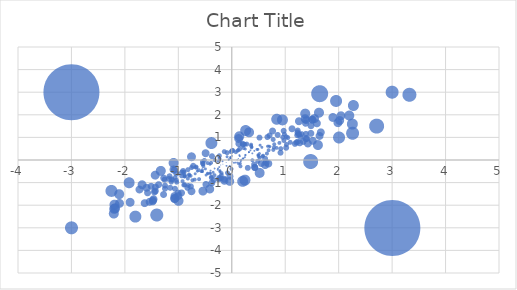
| Category | Series 0 |
|---|---|
| 0.160946651876732 | -0.274 |
| -0.615124180067025 | -0.841 |
| -0.238992660518427 | 0.202 |
| 0.614980688566654 | 0.075 |
| -0.901399740475513 | -1.096 |
| 0.348077717998722 | 0.426 |
| 0.947959158309703 | 1.018 |
| -1.72987447164957 | -1.3 |
| 0.0971250760577167 | 0.05 |
| 1.37857743076593 | 0.961 |
| -0.916733728524122 | -0.47 |
| -1.035666336437 | -0.968 |
| -0.224145165452657 | -0.513 |
| 2.70219252104673 | 1.52 |
| 0.520233681443548 | -0.569 |
| -0.459716828268949 | -0.57 |
| 0.765993572091399 | 0.927 |
| -0.802699944823501 | -0.633 |
| -0.262195468911025 | -0.371 |
| 1.58348036764361 | 1.645 |
| 1.65870819725486 | 1.239 |
| -0.390094702698103 | 0.77 |
| -1.07746904537421 | -1.686 |
| -0.242535334187792 | -0.772 |
| -1.57870613654062 | -1.445 |
| -0.894718571122171 | -0.531 |
| 0.516387038247074 | 0.995 |
| -1.62979103842948 | -1.91 |
| 0.296839254848134 | -0.343 |
| 0.278366491918356 | 0.71 |
| -1.13284176934728 | -0.975 |
| -0.324500552176947 | 0.012 |
| -1.33606163125554 | -0.464 |
| 0.380607522894947 | 0.303 |
| 2.0134998490355 | 1.759 |
| -1.43600033947788 | -1.179 |
| 1.04205325234069 | 1.003 |
| 0.244543674262494 | 0.227 |
| 1.38559620247189 | 1.161 |
| 0.248287439296835 | 0.247 |
| 0.133289291835339 | 1.064 |
| -2.25582289472346 | -1.358 |
| -0.398868811937196 | -0.466 |
| 0.199769403632539 | 0.698 |
| 1.22291797992834 | 1.235 |
| -0.342927631277945 | -0.869 |
| -0.143765697169237 | -0.849 |
| 0.412032153731006 | -0.189 |
| 1.2289241542928 | 0.813 |
| 1.42092287875088 | 0.737 |
| -0.0943369723016265 | 0.338 |
| 0.154736995946148 | -0.14 |
| -0.729374576435108 | -0.239 |
| -0.685610712656531 | -0.609 |
| -1.40929884094785 | -2.42 |
| -0.939915624690563 | -0.534 |
| -1.60339226401106 | -1.211 |
| 0.00958780984204322 | 0.435 |
| -0.410777708551837 | -0.18 |
| 0.12003371847159 | 0.444 |
| 0.31656943258921 | 0.356 |
| -0.739846252762422 | -0.888 |
| 1.3736298282967 | 2.054 |
| 1.26277412193541 | 0.779 |
| 0.659726460285925 | 1.033 |
| -0.193893966526571 | -0.571 |
| -0.554283939642186 | -0.421 |
| -1.25595506815388 | -1.118 |
| -0.884081299107951 | -0.73 |
| -1.16478087259423 | -0.719 |
| -1.0696558947721 | -1.255 |
| 0.575700237428579 | 0.159 |
| 2.24777841377026 | 1.61 |
| 0.238687291933 | -0.873 |
| 0.761270682578169 | 1.286 |
| -0.35464424898648 | -0.531 |
| -2.2077409492235 | -2.368 |
| -0.037189918367408 | -0.262 |
| 0.0328181724199283 | -0.103 |
| -1.18071868225266 | -0.828 |
| 0.176503539493442 | 0.029 |
| 1.47801327160652 | 1.527 |
| -0.226956332484346 | -0.458 |
| -0.881372321196067 | -0.713 |
| 0.521825087151675 | 0.102 |
| 0.480749457099265 | 0.487 |
| -0.576551001997264 | -0.497 |
| 0.165373655010413 | -0.049 |
| 0.0961730276308223 | 0.003 |
| -1.0795466274732 | -1.578 |
| -1.04372701538641 | -0.884 |
| -0.552592535449565 | -0.496 |
| -0.144643103648489 | -0.902 |
| 0.255553105737754 | 1.313 |
| -0.645754552755135 | -0.493 |
| 0.366965786381292 | 0.542 |
| -1.45540269402899 | -1.396 |
| 0.36171378940403 | 0.68 |
| 0.584738888834613 | 0.193 |
| 1.2303702555631 | 1.313 |
| 0.13612221278788 | 0.23 |
| -0.75641933311179 | 0.148 |
| 0.201461556067091 | 0.728 |
| 1.2350449519675 | 1.165 |
| 0.122176622145269 | 0.079 |
| 2.26921479009631 | 2.426 |
| 1.36709151016331 | 1.839 |
| -1.09699595095752 | -0.408 |
| -2.10922785658634 | -1.505 |
| -0.492223106867984 | -1.058 |
| 1.6258528814413 | 2.107 |
| 1.21625775715046 | 1.117 |
| -0.236066546333457 | 0.075 |
| -0.167677831941503 | -0.179 |
| 0.140998784969456 | 0.191 |
| -1.43650247367118 | -0.664 |
| -0.0590232346457145 | 0.038 |
| 0.64011578054153 | -0.109 |
| 0.00128070794671652 | 0.18 |
| 0.619913414094182 | -0.218 |
| 0.110262010027443 | -0.113 |
| -1.92261768418304 | -1.002 |
| -0.024052773794113 | 0.144 |
| -0.386362633615433 | -0.732 |
| -0.69812768671063 | -0.859 |
| 0.00202187886730832 | 0.434 |
| -0.205936368594316 | -0.806 |
| -1.0762481700825 | -0.443 |
| -0.77108477696187 | -1.153 |
| 1.33181821435059 | 0.834 |
| -1.3773593544243 | -1.071 |
| -1.00842096559924 | -1.454 |
| -0.921229870327564 | -0.936 |
| 0.236247621529173 | 0.142 |
| 1.88459375859967 | 1.9 |
| 2.19072418627481 | 1.986 |
| 1.3024521514489 | 1.157 |
| -2.20157151487506 | -1.961 |
| 1.01436566004417 | 1.037 |
| 0.0678569007901561 | 0.364 |
| -1.00365372459943 | -1.792 |
| 1.63546048211918 | 2.956 |
| -0.550327791081784 | -0.148 |
| -0.390768462835063 | -0.767 |
| -0.395259857391023 | -0.104 |
| -0.492406833780947 | 0.308 |
| -0.263170050333482 | -0.044 |
| 0.378366619189462 | 0.574 |
| 0.54558768172162 | -0.136 |
| -0.0424101694434541 | -0.702 |
| -1.0750092090895 | -1.68 |
| 0.124514748254044 | -0.159 |
| -0.375935062910946 | 0.18 |
| -0.565899622209159 | -0.496 |
| -0.825763906440871 | -0.807 |
| -1.16081348131615 | -1.209 |
| -0.109728575653995 | -0.101 |
| -0.0455316197579109 | -0.929 |
| 0.910025577600881 | 0.327 |
| 1.38893253292281 | 1.769 |
| 1.0101751389894 | 0.56 |
| -0.545302776391033 | -1.365 |
| -0.450405230399172 | -0.601 |
| 0.242665773001131 | 0.697 |
| 1.2779776062032 | 1.046 |
| -1.04154395099007 | -0.592 |
| -1.0626679138137 | -0.78 |
| -0.0860539900831163 | -0.558 |
| -1.68508825794761 | -1.08 |
| 1.38015558291626 | 1.625 |
| 0.693585618785266 | 0.617 |
| 0.0698282360754584 | -0.101 |
| -0.88428149226856 | -1.084 |
| -1.00349428980333 | -1.586 |
| 1.18042031157257 | 0.717 |
| 0.702056181231306 | 1.095 |
| 0.970159951329162 | 1.294 |
| -0.328233349768707 | -0.66 |
| -0.546224963680282 | -0.151 |
| -0.674321752569604 | -0.299 |
| 2.03940004097518 | 1.964 |
| -0.0923888042261494 | 0.153 |
| 0.379372548008352 | 0.003 |
| 0.42054064236529 | 0.409 |
| -0.813005153942068 | -1.127 |
| -0.822989326925402 | -0.423 |
| 0.775944859024639 | 0.448 |
| 0.788241458064685 | 0.711 |
| 1.20473229722529 | 0.781 |
| -0.0236723286031344 | 0.087 |
| 0.429523897796119 | -0.335 |
| 0.463733253037703 | 0.487 |
| 0.888151323778845 | 0.763 |
| -1.47861732795065 | -1.777 |
| -0.500011720506139 | -0.378 |
| -0.416460606544414 | -1.275 |
| 0.55854076793319 | 0.571 |
| -0.0657614272614474 | 0.043 |
| 1.5138828670756 | 0.852 |
| 0.66754260112605 | 0.612 |
| -1.43892465839805 | -1.349 |
| -0.51290087609768 | -0.018 |
| 1.97966356263047 | 1.666 |
| -1.48309015848548 | -1.826 |
| -0.019887579662568 | 0.389 |
| 1.2555482917587 | 1.718 |
| 0.680843910542844 | 0.454 |
| -0.326343721841577 | -0.364 |
| 0.197698675892169 | -0.931 |
| -0.264216122106881 | -0.429 |
| 0.486586738728479 | 0.239 |
| 1.94997847738214 | 2.616 |
| 0.139028796722356 | 0.516 |
| -0.0317218298179695 | 0.097 |
| -0.482221897910345 | -0.662 |
| -0.241093974616651 | -0.851 |
| 0.207953673906911 | 0.086 |
| -1.28273411839393 | -1.513 |
| 0.125771678213468 | 0.741 |
| 1.46788754006885 | -0.049 |
| 3.32343380635767 | 2.887 |
| 0.426327517144408 | -0.316 |
| -0.0339004019946538 | 0.119 |
| -0.0678033009383072 | -0.021 |
| 1.39525643035082 | 0.965 |
| -0.666544754048096 | -0.326 |
| -0.403732817304221 | -0.593 |
| 0.966590798569188 | 0.884 |
| -2.20514255359296 | -2.15 |
| 0.484861432099603 | -0.053 |
| -0.763456804936866 | -1.361 |
| -0.381861767540705 | -0.998 |
| -0.83482516298054 | -1.221 |
| -2.18994161618382 | -2.122 |
| -1.51172002682511 | -1.157 |
| -0.754175929338002 | -0.33 |
| 0.318139938455239 | 0.356 |
| -0.105247894469921 | -0.244 |
| 0.98484274173271 | 1.141 |
| -1.25473167513168 | -1.256 |
| -1.1345868180428 | -0.841 |
| 0.850667287558489 | 1.128 |
| 1.61044612653865 | 0.664 |
| 0.25210804593591 | 0.487 |
| 0.835894666147173 | 0.537 |
| 0.357937355647725 | 0.632 |
| 0.122584566144871 | 0.964 |
| 1.09202887720885 | 0.784 |
| 1.47248109070115 | 1.196 |
| 1.99775325983894 | 1.017 |
| -0.538261719624117 | -0.258 |
| 0.529077525481578 | 0.656 |
| -0.199194769550409 | -0.663 |
| 0.655356984430444 | 0.291 |
| -0.207936896883428 | -0.22 |
| -0.940973271419177 | -1.454 |
| 1.02027044221596 | 0.694 |
| -0.803480649208657 | -0.671 |
| 0.91369874199455 | 0.507 |
| 1.64000634739927 | 1.07 |
| 0.0985160587595522 | 0.423 |
| -0.410758595790261 | -0.558 |
| 0.200581486312416 | 0.086 |
| -0.626210963654759 | -0.427 |
| 1.26054726828803 | 1.154 |
| 1.53971655516129 | 1.855 |
| 0.49390800073465 | 0.207 |
| -1.47165023821116 | -1.717 |
| 0.782961502888384 | 0.564 |
| 2.25179867651005 | 1.204 |
| -1.91011920966467 | -1.853 |
| -0.942837836996195 | -0.688 |
| 0.163225356632326 | 0 |
| -1.53997235436216 | -1.845 |
| 0.939710285118875 | 1.793 |
| 0.714115682199137 | 0.59 |
| 1.11935938199218 | 1.4 |
| -1.81219758921645 | -2.484 |
| -0.778476273618659 | -0.686 |
| 1.50741773374501 | 1.784 |
| 0.2166167955714 | 0.539 |
| 0.318288197268549 | 1.237 |
| 0.679416957951939 | -0.149 |
| -1.27789218373092 | -0.789 |
| -1.09252514449825 | -0.121 |
| -1.11055880117744 | -0.884 |
| 0.0146863698437351 | -0.077 |
| -0.0119868387715316 | -0.375 |
| 1.49859953606058 | 1.802 |
| 0.512708793770507 | 0.297 |
| -1.25662266978372 | -0.866 |
| -0.176623119742162 | -0.043 |
| -0.139811636845756 | 0.369 |
| -0.453674707860817 | -0.125 |
| -2.10246643953756 | -1.916 |
| 0.495029409181156 | 0.182 |
| -0.877972482477954 | -0.678 |
| 0.839610825434974 | 1.806 |
| -0.241491200506211 | -0.295 |
| -0.550442895603169 | -0.073 |
| 3.0 | -3 |
| -3.0 | 3 |
| 3.0 | 3 |
| -3.0 | -3 |